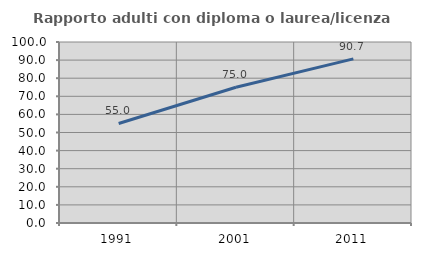
| Category | Rapporto adulti con diploma o laurea/licenza media  |
|---|---|
| 1991.0 | 55 |
| 2001.0 | 75 |
| 2011.0 | 90.698 |